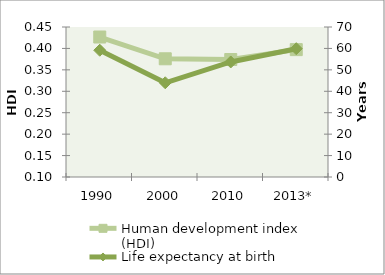
| Category | Human development index (HDI) |
|---|---|
| 1990 | 0.427 |
| 2000 | 0.376 |
| 2010 | 0.374 |
| 2013* | 0.397 |